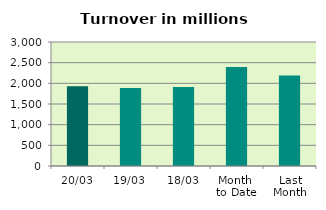
| Category | Series 0 |
|---|---|
| 20/03 | 1931.289 |
| 19/03 | 1888.061 |
| 18/03 | 1912.185 |
| Month 
to Date | 2396.054 |
| Last
Month | 2191.938 |